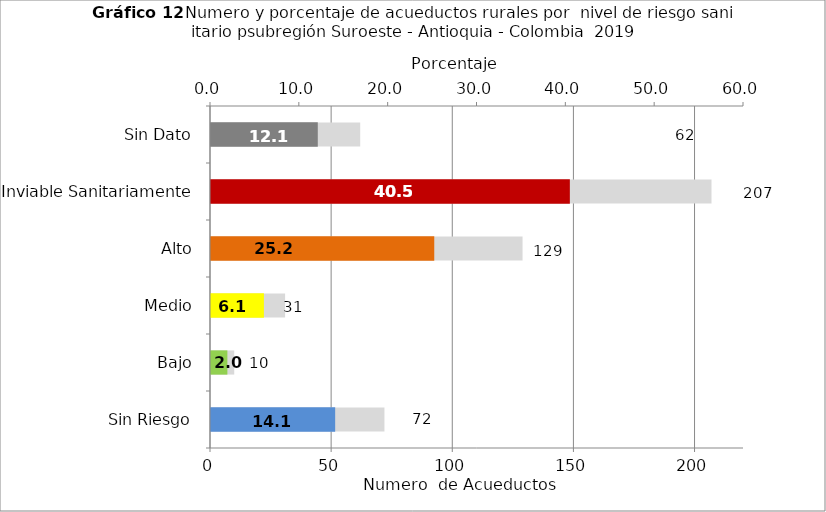
| Category | Número de Sistemas |
|---|---|
| Sin Riesgo | 72 |
| Bajo | 10 |
| Medio | 31 |
| Alto | 129 |
| Inviable Sanitariamente | 207 |
| Sin Dato | 62 |